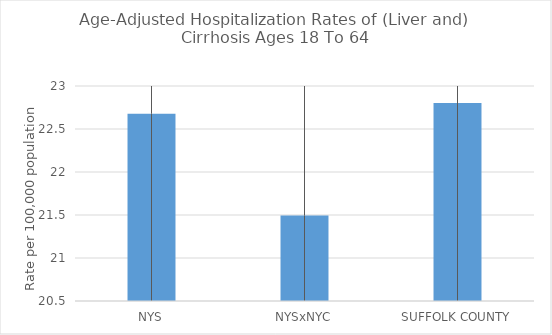
| Category | Age-Adjusted Hospitalization Rates of (Liver and) Cirrhosis Ages 18 To 64 |
|---|---|
| NYS | 22.678 |
| NYSxNYC | 21.494 |
| SUFFOLK COUNTY | 22.802 |